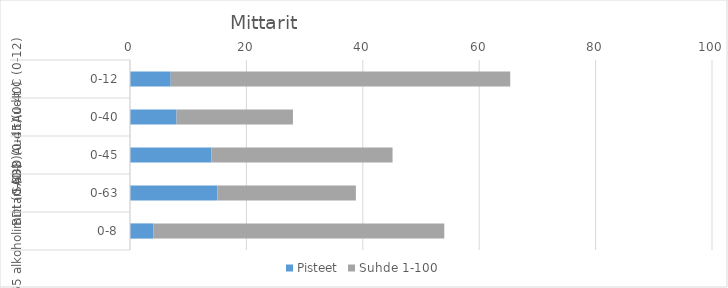
| Category | Pisteet | Suhde 1-100 |
|---|---|---|
| 0 | 7 | 58.333 |
| 1 | 8 | 20 |
| 2 | 14 | 31.111 |
| 3 | 15 | 23.81 |
| 4 | 4 | 50 |